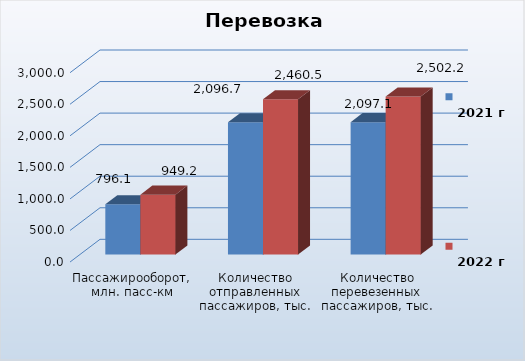
| Category | 
2021 г | 
2022 г |
|---|---|---|
| Пассажирооборот, млн. пасс-км | 796.1 | 949.2 |
| Количество отправленных пассажиров, тыс. чел. | 2096.7 | 2460.5 |
| Количество перевезенных пассажиров, тыс. чел. | 2097.1 | 2502.2 |